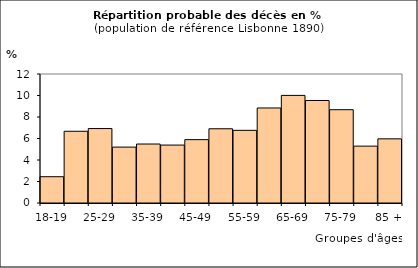
| Category | Series 0 |
|---|---|
| 18-19 | 2.445 |
| 20-24 | 6.672 |
| 25-29 | 6.926 |
| 30-34 | 5.2 |
| 35-39 | 5.487 |
| 40-44 | 5.388 |
| 45-49 | 5.895 |
| 50-54 | 6.905 |
| 55-59 | 6.76 |
| 60-64 | 8.839 |
| 65-69 | 10.01 |
| 70-74 | 9.537 |
| 75-79 | 8.679 |
| 80-84 | 5.29 |
| 85 + | 5.969 |